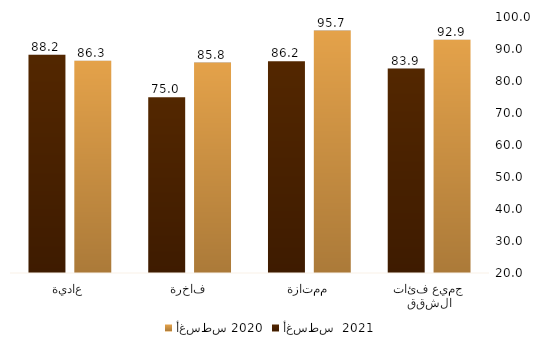
| Category | أغسطس 2020 | أغسطس  2021 |
|---|---|---|
| جميع فئات الشقق | 92.923 | 83.901 |
| ممتازة | 95.745 | 86.183 |
| فاخرة | 85.765 | 74.951 |
| عادية | 86.326 | 88.208 |